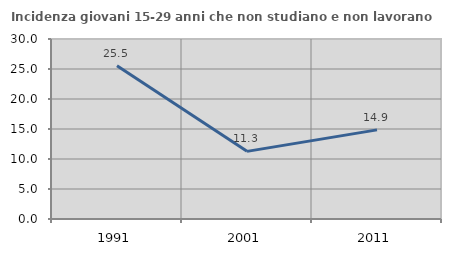
| Category | Incidenza giovani 15-29 anni che non studiano e non lavorano  |
|---|---|
| 1991.0 | 25.55 |
| 2001.0 | 11.273 |
| 2011.0 | 14.852 |